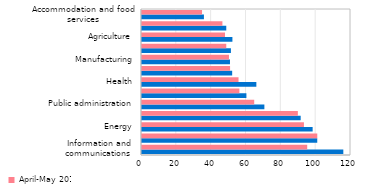
| Category | April-May 2020 | April-May 2019 |
|---|---|---|
| Information and communications  | 115.589 | 94.858 |
| Financial sector | 100.623 | 100.64 |
| Energy | 97.976 | 92.976 |
| Mining | 91.106 | 89.483 |
| Public administration | 70.266 | 64.425 |
| Education | 59.947 | 55.923 |
| Health | 65.658 | 55.423 |
| Transport and storage  | 51.777 | 50.574 |
| Manufacturing | 50.515 | 49.927 |
| Construction | 51.051 | 48.385 |
| Agriculture | 51.912 | 47.652 |
| Trade | 48.387 | 46.171 |
| Accommodation and food services | 35.551 | 34.477 |